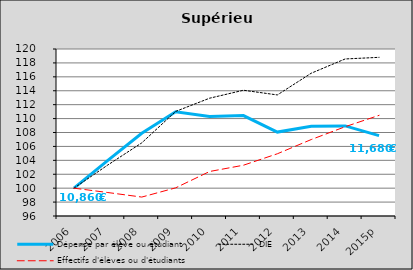
| Category | Dépense par élève ou étudiant  | DIE | Effectifs d'élèves ou d'étudiants |
|---|---|---|---|
| 2006 | 100 | 100 | 100 |
| 2007 | 103.986 | 103.334 | 99.373 |
| 2008 | 107.888 | 106.507 | 98.721 |
| 2009 | 110.978 | 111.029 | 100.046 |
| 2010 | 110.288 | 112.927 | 102.393 |
| 2011 | 110.432 | 114.074 | 103.298 |
| 2012 | 108.057 | 113.398 | 104.943 |
| 2013 | 108.911 | 116.522 | 106.988 |
| 2014 | 108.948 | 118.568 | 108.83 |
| 2015p | 107.546 | 118.802 | 110.466 |